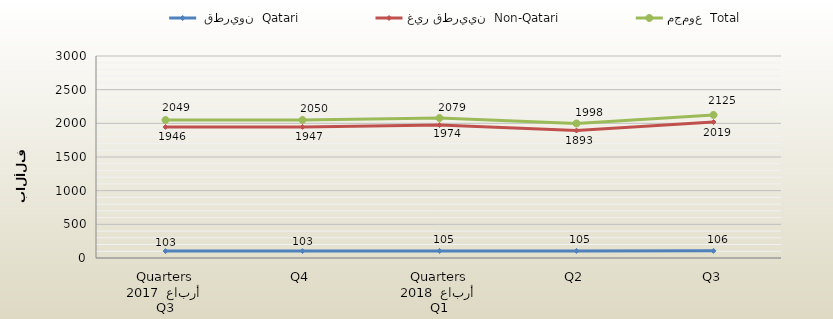
| Category |  قطريون  Qatari | غير قطريين  Non-Qatari | مجموع  Total |
|---|---|---|---|
| 0 | 103 | 1946 | 2049 |
| 1 | 103 | 1947 | 2050 |
| 2 | 105 | 1974 | 2079 |
| 3 | 105 | 1893 | 1998 |
| 4 | 106 | 2019 | 2125 |